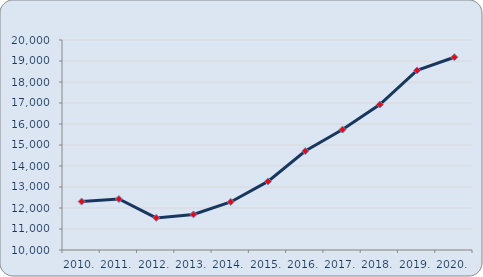
| Category | Series 1 |
|---|---|
| 2010. | 12308 |
| 2011. | 12427 |
| 2012. | 11530 |
| 2013. | 11693 |
| 2014. | 12288 |
| 2015. | 13267 |
| 2016. | 14713 |
| 2017. | 15735 |
| 2018. | 16926 |
| 2019. | 18553 |
| 2020. | 19180 |